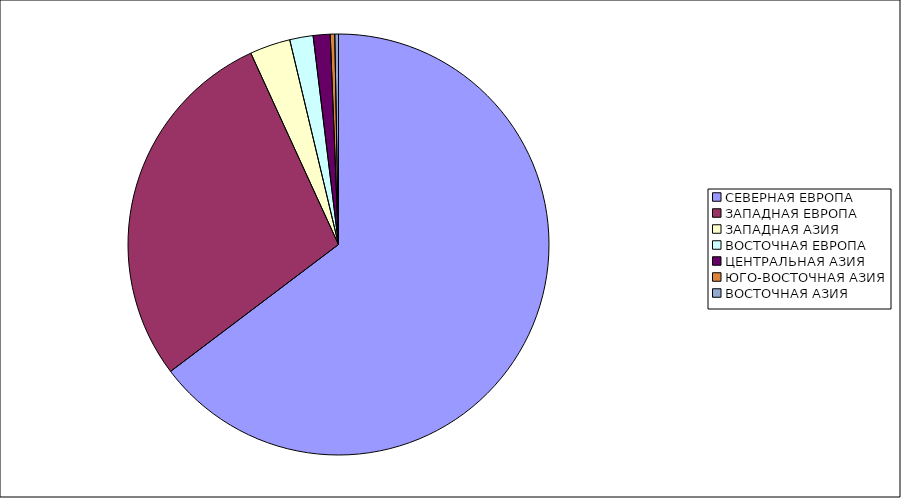
| Category | Оборот |
|---|---|
| СЕВЕРНАЯ ЕВРОПА | 64.698 |
| ЗАПАДНАЯ ЕВРОПА | 28.46 |
| ЗАПАДНАЯ АЗИЯ | 3.116 |
| ВОСТОЧНАЯ ЕВРОПА | 1.794 |
| ЦЕНТРАЛЬНАЯ АЗИЯ | 1.301 |
| ЮГО-ВОСТОЧНАЯ АЗИЯ | 0.345 |
| ВОСТОЧНАЯ АЗИЯ | 0.283 |